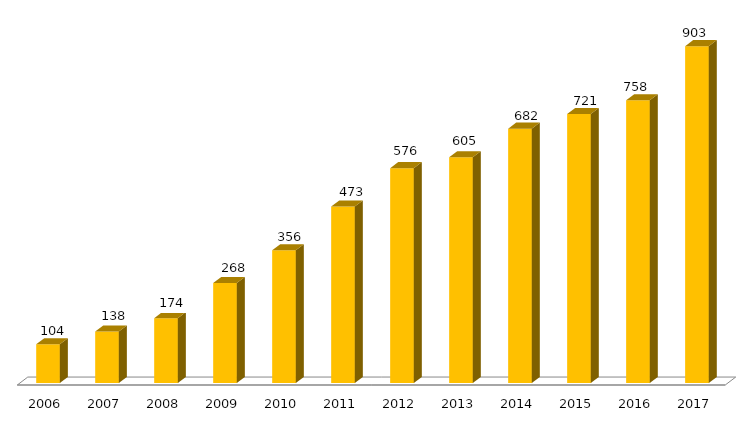
| Category | Programa |
|---|---|
| 2006.0 | 104 |
| 2007.0 | 138 |
| 2008.0 | 174 |
| 2009.0 | 268 |
| 2010.0 | 356 |
| 2011.0 | 473 |
| 2012.0 | 576 |
| 2013.0 | 605 |
| 2014.0 | 682 |
| 2015.0 | 721 |
| 2016.0 | 758 |
| 2017.0 | 903 |